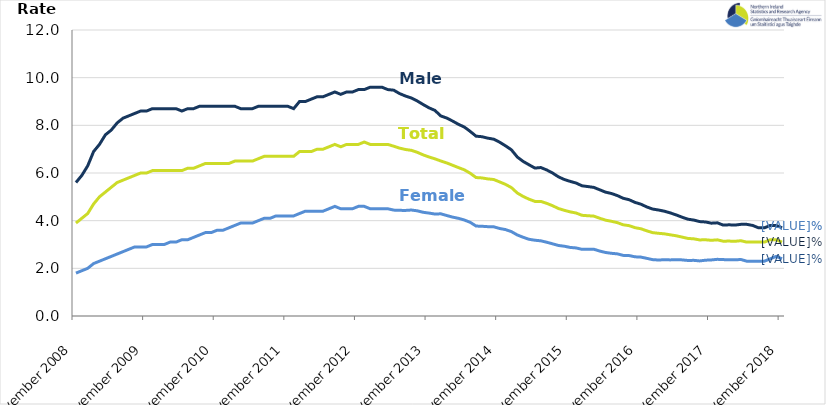
| Category | Male | Female | Total |
|---|---|---|---|
| 2008-11-01 | 5.6 | 1.8 | 3.9 |
| 2008-12-01 | 5.9 | 1.9 | 4.1 |
| 2009-01-01 | 6.3 | 2 | 4.3 |
| 2009-02-01 | 6.9 | 2.2 | 4.7 |
| 2009-03-01 | 7.2 | 2.3 | 5 |
| 2009-04-01 | 7.6 | 2.4 | 5.2 |
| 2009-05-01 | 7.8 | 2.5 | 5.4 |
| 2009-06-01 | 8.1 | 2.6 | 5.6 |
| 2009-07-01 | 8.3 | 2.7 | 5.7 |
| 2009-08-01 | 8.4 | 2.8 | 5.8 |
| 2009-09-01 | 8.5 | 2.9 | 5.9 |
| 2009-10-01 | 8.6 | 2.9 | 6 |
| 2009-11-01 | 8.6 | 2.9 | 6 |
| 2009-12-01 | 8.7 | 3 | 6.1 |
| 2010-01-01 | 8.7 | 3 | 6.1 |
| 2010-02-01 | 8.7 | 3 | 6.1 |
| 2010-03-01 | 8.7 | 3.1 | 6.1 |
| 2010-04-01 | 8.7 | 3.1 | 6.1 |
| 2010-05-01 | 8.6 | 3.2 | 6.1 |
| 2010-06-01 | 8.7 | 3.2 | 6.2 |
| 2010-07-01 | 8.7 | 3.3 | 6.2 |
| 2010-08-01 | 8.8 | 3.4 | 6.3 |
| 2010-09-01 | 8.8 | 3.5 | 6.4 |
| 2010-10-01 | 8.8 | 3.5 | 6.4 |
| 2010-11-01 | 8.8 | 3.6 | 6.4 |
| 2010-12-01 | 8.8 | 3.6 | 6.4 |
| 2011-01-01 | 8.8 | 3.7 | 6.4 |
| 2011-02-01 | 8.8 | 3.8 | 6.5 |
| 2011-03-01 | 8.7 | 3.9 | 6.5 |
| 2011-04-01 | 8.7 | 3.9 | 6.5 |
| 2011-05-01 | 8.7 | 3.9 | 6.5 |
| 2011-06-01 | 8.8 | 4 | 6.6 |
| 2011-07-01 | 8.8 | 4.1 | 6.7 |
| 2011-08-01 | 8.8 | 4.1 | 6.7 |
| 2011-09-01 | 8.8 | 4.2 | 6.7 |
| 2011-10-01 | 8.8 | 4.2 | 6.7 |
| 2011-11-01 | 8.8 | 4.2 | 6.7 |
| 2011-12-01 | 8.7 | 4.2 | 6.7 |
| 2012-01-01 | 9 | 4.3 | 6.9 |
| 2012-02-01 | 9 | 4.4 | 6.9 |
| 2012-03-01 | 9.1 | 4.4 | 6.9 |
| 2012-04-01 | 9.2 | 4.4 | 7 |
| 2012-05-01 | 9.2 | 4.4 | 7 |
| 2012-06-01 | 9.3 | 4.5 | 7.1 |
| 2012-07-01 | 9.4 | 4.6 | 7.2 |
| 2012-08-01 | 9.3 | 4.5 | 7.1 |
| 2012-09-01 | 9.4 | 4.5 | 7.2 |
| 2012-10-01 | 9.4 | 4.5 | 7.2 |
| 2012-11-01 | 9.5 | 4.6 | 7.2 |
| 2012-12-01 | 9.5 | 4.6 | 7.3 |
| 2013-01-01 | 9.6 | 4.5 | 7.2 |
| 2013-02-01 | 9.6 | 4.5 | 7.2 |
| 2013-03-01 | 9.6 | 4.5 | 7.2 |
| 2013-04-01 | 9.5 | 4.5 | 7.2 |
| 2013-05-01 | 9.476 | 4.443 | 7.125 |
| 2013-06-01 | 9.332 | 4.433 | 7.043 |
| 2013-07-01 | 9.229 | 4.43 | 6.987 |
| 2013-08-01 | 9.146 | 4.446 | 6.95 |
| 2013-09-01 | 9.022 | 4.413 | 6.869 |
| 2013-10-01 | 8.874 | 4.352 | 6.761 |
| 2013-11-01 | 8.735 | 4.318 | 6.671 |
| 2013-12-01 | 8.627 | 4.278 | 6.595 |
| 2014-01-01 | 8.395 | 4.288 | 6.505 |
| 2014-02-01 | 8.306 | 4.217 | 6.424 |
| 2014-03-01 | 8.181 | 4.149 | 6.326 |
| 2014-04-01 | 8.043 | 4.098 | 6.228 |
| 2014-05-01 | 7.929 | 4.028 | 6.134 |
| 2014-06-01 | 7.745 | 3.931 | 5.99 |
| 2014-07-01 | 7.545 | 3.774 | 5.81 |
| 2014-08-01 | 7.522 | 3.765 | 5.793 |
| 2014-09-01 | 7.461 | 3.748 | 5.752 |
| 2014-10-01 | 7.419 | 3.743 | 5.727 |
| 2014-11-01 | 7.293 | 3.672 | 5.627 |
| 2014-12-01 | 7.141 | 3.626 | 5.523 |
| 2015-01-01 | 6.975 | 3.54 | 5.389 |
| 2015-02-01 | 6.672 | 3.401 | 5.162 |
| 2015-03-01 | 6.485 | 3.302 | 5.016 |
| 2015-04-01 | 6.344 | 3.219 | 4.901 |
| 2015-05-01 | 6.207 | 3.179 | 4.809 |
| 2015-06-01 | 6.229 | 3.154 | 4.809 |
| 2015-07-01 | 6.128 | 3.095 | 4.728 |
| 2015-08-01 | 5.999 | 3.028 | 4.627 |
| 2015-09-01 | 5.839 | 2.959 | 4.509 |
| 2015-10-01 | 5.727 | 2.927 | 4.434 |
| 2015-11-01 | 5.648 | 2.877 | 4.368 |
| 2015-12-01 | 5.578 | 2.856 | 4.321 |
| 2016-01-01 | 5.463 | 2.797 | 4.225 |
| 2016-02-01 | 5.431 | 2.796 | 4.207 |
| 2016-03-01 | 5.396 | 2.802 | 4.191 |
| 2016-04-01 | 5.297 | 2.726 | 4.103 |
| 2016-05-01 | 5.198 | 2.665 | 4.021 |
| 2016-06-01 | 5.14 | 2.631 | 3.974 |
| 2016-07-01 | 5.054 | 2.608 | 3.918 |
| 2016-08-01 | 4.939 | 2.544 | 3.827 |
| 2016-09-01 | 4.88 | 2.537 | 3.791 |
| 2016-10-01 | 4.768 | 2.483 | 3.707 |
| 2016-11-01 | 4.692 | 2.471 | 3.661 |
| 2016-12-01 | 4.577 | 2.42 | 3.575 |
| 2017-01-01 | 4.487 | 2.365 | 3.498 |
| 2017-02-01 | 4.447 | 2.349 | 3.469 |
| 2017-03-01 | 4.397 | 2.362 | 3.448 |
| 2017-04-01 | 4.326 | 2.354 | 3.407 |
| 2017-05-01 | 4.241 | 2.364 | 3.366 |
| 2017-06-01 | 4.147 | 2.354 | 3.311 |
| 2017-07-01 | 4.062 | 2.33 | 3.255 |
| 2017-08-01 | 4.025 | 2.335 | 3.237 |
| 2017-09-01 | 3.962 | 2.311 | 3.192 |
| 2017-10-01 | 3.945 | 2.341 | 3.198 |
| 2017-11-01 | 3.895 | 2.353 | 3.176 |
| 2017-12-01 | 3.909 | 2.378 | 3.196 |
| 2018-01-01 | 3.814 | 2.366 | 3.139 |
| 2018-02-01 | 3.826 | 2.361 | 3.143 |
| 2018-03-01 | 3.814 | 2.357 | 3.135 |
| 2018-04-01 | 3.846 | 2.371 | 3.159 |
| 2018-05-01 | 3.846 | 2.3 | 3.1 |
| 2018-06-01 | 3.8 | 2.3 | 3.1 |
| 2018-07-01 | 3.7 | 2.3 | 3.1 |
| 2018-08-01 | 3.7 | 2.3 | 3.1 |
| 2018-09-01 | 3.8 | 2.4 | 3.2 |
| 2018-10-01 | 3.8 | 2.5 | 3.2 |
| 2018-11-01 | 3.7 | 2.4 | 3.1 |